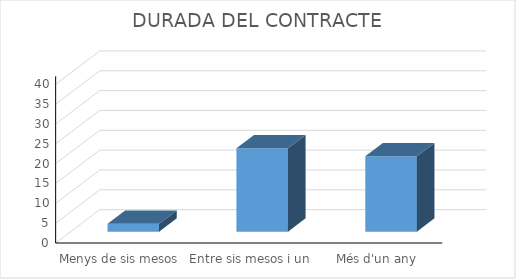
| Category | Series 0 |
|---|---|
| Menys de sis mesos | 2 |
| Entre sis mesos i un any | 21 |
| Més d'un any | 19 |